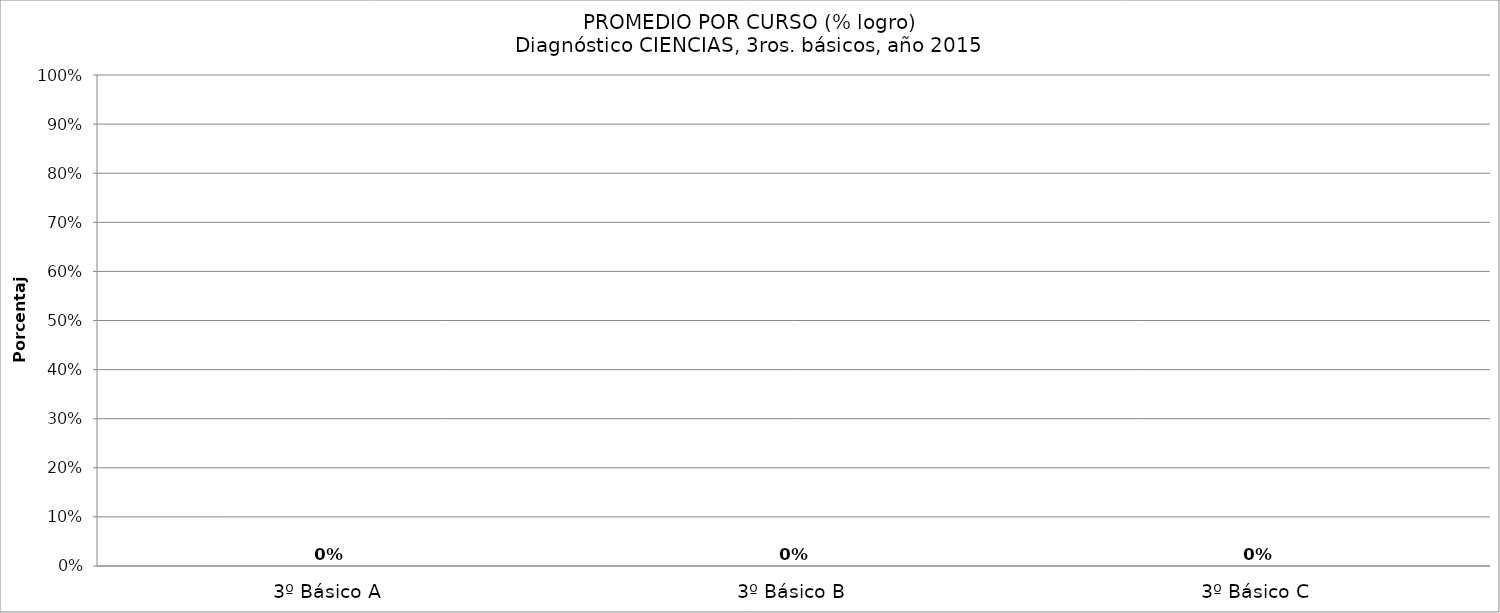
| Category | Series 0 |
|---|---|
| 3º Básico A | 0 |
| 3º Básico B | 0 |
| 3º Básico C | 0 |